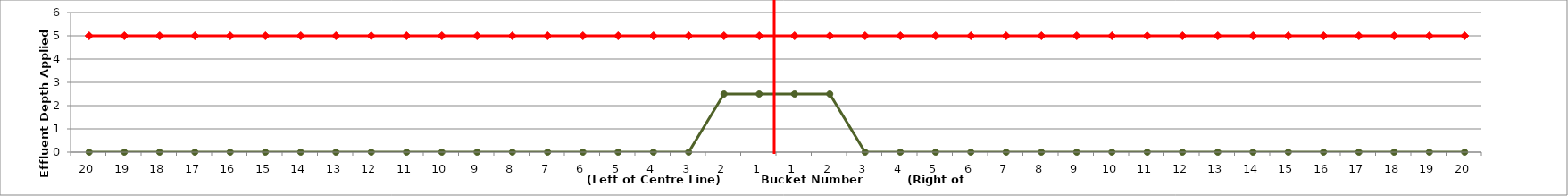
| Category | Series 3 | Series 0 |
|---|---|---|
| 20.0 | 0 | 5 |
| 19.0 | 0 | 5 |
| 18.0 | 0 | 5 |
| 17.0 | 0 | 5 |
| 16.0 | 0 | 5 |
| 15.0 | 0 | 5 |
| 14.0 | 0 | 5 |
| 13.0 | 0 | 5 |
| 12.0 | 0 | 5 |
| 11.0 | 0 | 5 |
| 10.0 | 0 | 5 |
| 9.0 | 0 | 5 |
| 8.0 | 0 | 5 |
| 7.0 | 0 | 5 |
| 6.0 | 0 | 5 |
| 5.0 | 0 | 5 |
| 4.0 | 0 | 5 |
| 3.0 | 0 | 5 |
| 2.0 | 2.5 | 5 |
| 1.0 | 2.5 | 5 |
| 1.0 | 2.5 | 5 |
| 2.0 | 2.5 | 5 |
| 3.0 | 0 | 5 |
| 4.0 | 0 | 5 |
| 5.0 | 0 | 5 |
| 6.0 | 0 | 5 |
| 7.0 | 0 | 5 |
| 8.0 | 0 | 5 |
| 9.0 | 0 | 5 |
| 10.0 | 0 | 5 |
| 11.0 | 0 | 5 |
| 12.0 | 0 | 5 |
| 13.0 | 0 | 5 |
| 14.0 | 0 | 5 |
| 15.0 | 0 | 5 |
| 16.0 | 0 | 5 |
| 17.0 | 0 | 5 |
| 18.0 | 0 | 5 |
| 19.0 | 0 | 5 |
| 20.0 | 0 | 5 |